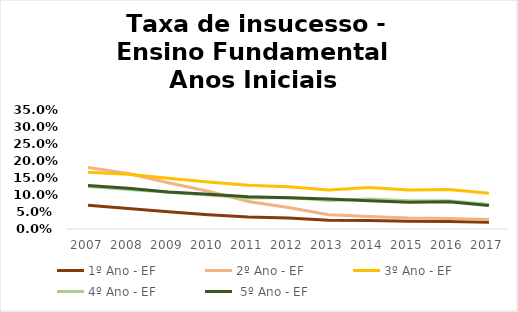
| Category | 1º Ano - EF  | 2º Ano - EF | 3º Ano - EF | 4º Ano - EF |  5º Ano - EF |
|---|---|---|---|---|---|
| 2007.0 | 0.07 | 0.181 | 0.167 | 0.125 | 0.128 |
| 2008.0 | 0.06 | 0.163 | 0.161 | 0.116 | 0.12 |
| 2009.0 | 0.051 | 0.136 | 0.149 | 0.108 | 0.109 |
| 2010.0 | 0.042 | 0.111 | 0.138 | 0.1 | 0.102 |
| 2011.0 | 0.035 | 0.081 | 0.129 | 0.091 | 0.095 |
| 2012.0 | 0.032 | 0.063 | 0.124 | 0.093 | 0.092 |
| 2013.0 | 0.026 | 0.042 | 0.115 | 0.084 | 0.088 |
| 2014.0 | 0.025 | 0.037 | 0.122 | 0.088 | 0.083 |
| 2015.0 | 0.023 | 0.032 | 0.115 | 0.083 | 0.079 |
| 2016.0 | 0.022 | 0.031 | 0.116 | 0.083 | 0.08 |
| 2017.0 | 0.02 | 0.028 | 0.105 | 0.072 | 0.069 |